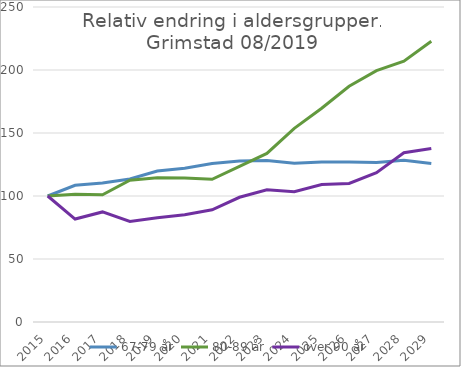
| Category | 67-79 år | 80-89 år | over 90 år |
|---|---|---|---|
| 2015.0 | 100 | 100 | 100 |
| 2016.0 | 108.457 | 101.416 | 81.698 |
| 2017.0 | 110.313 | 100.959 | 87.358 |
| 2018.0 | 113.485 | 112.517 | 79.811 |
| 2019.0 | 119.888 | 114.387 | 82.727 |
| 2020.0 | 121.957 | 114.252 | 85.059 |
| 2021.0 | 125.763 | 113.224 | 89.025 |
| 2022.0 | 127.747 | 123.499 | 98.984 |
| 2023.0 | 128.102 | 133.806 | 104.986 |
| 2024.0 | 126.018 | 153.64 | 103.376 |
| 2025.0 | 127.052 | 169.625 | 109.175 |
| 2026.0 | 127.027 | 187.11 | 109.909 |
| 2027.0 | 126.647 | 199.498 | 118.48 |
| 2028.0 | 128.351 | 207.056 | 134.289 |
| 2029.0 | 125.751 | 222.866 | 137.736 |